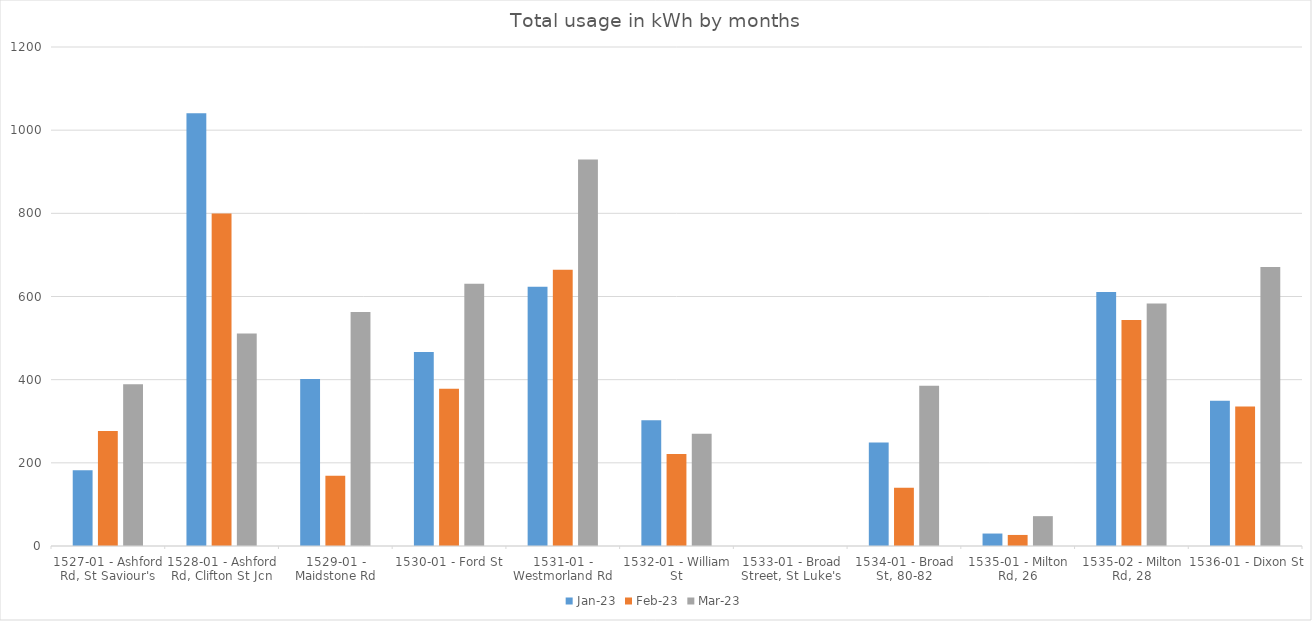
| Category | Jan-23 | Feb-23 | Mar-23 |
|---|---|---|---|
| 1527-01 - Ashford Rd, St Saviour's | 182.32 | 276.38 | 388.82 |
| 1528-01 - Ashford Rd, Clifton St Jcn | 1040.55 | 799.63 | 511.14 |
| 1529-01 - Maidstone Rd | 401.59 | 169.11 | 562.97 |
| 1530-01 - Ford St | 466.4 | 377.99 | 630.58 |
| 1531-01 - Westmorland Rd | 623.23 | 664.17 | 929.48 |
| 1532-01 - William St | 302.23 | 221.52 | 269.72 |
| 1533-01 - Broad Street, St Luke's | 0 | 0 | 0 |
| 1534-01 - Broad St, 80-82 | 249.15 | 140.34 | 385.2 |
| 1535-01 - Milton Rd, 26 | 29.97 | 26.58 | 71.76 |
| 1535-02 - Milton Rd, 28 | 610.84 | 543.33 | 583.4 |
| 1536-01 - Dixon St | 349.1 | 335.28 | 670.82 |